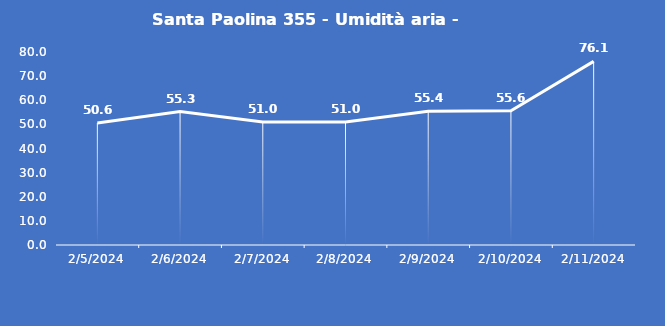
| Category | Santa Paolina 355 - Umidità aria - Grezzo (%) |
|---|---|
| 2/5/24 | 50.6 |
| 2/6/24 | 55.3 |
| 2/7/24 | 51 |
| 2/8/24 | 51 |
| 2/9/24 | 55.4 |
| 2/10/24 | 55.6 |
| 2/11/24 | 76.1 |